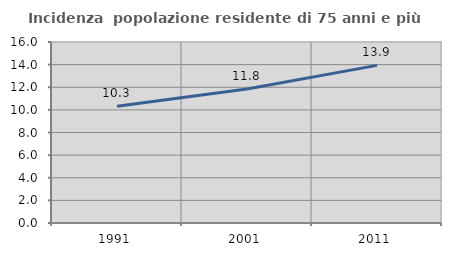
| Category | Incidenza  popolazione residente di 75 anni e più |
|---|---|
| 1991.0 | 10.321 |
| 2001.0 | 11.846 |
| 2011.0 | 13.936 |